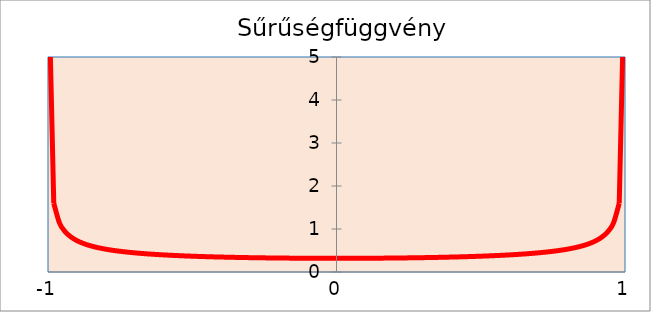
| Category | Series 0 |
|---|---|
| -0.999 | 7.119 |
| -0.98 | 1.6 |
| -0.96 | 1.137 |
| -0.94 | 0.933 |
| -0.92 | 0.812 |
| -0.9 | 0.73 |
| -0.88 | 0.67 |
| -0.86 | 0.624 |
| -0.84 | 0.587 |
| -0.82 | 0.556 |
| -0.8 | 0.531 |
| -0.78 | 0.509 |
| -0.76 | 0.49 |
| -0.74 | 0.473 |
| -0.72 | 0.459 |
| -0.7 | 0.446 |
| -0.68 | 0.434 |
| -0.66 | 0.424 |
| -0.64 | 0.414 |
| -0.62 | 0.406 |
| -0.6 | 0.398 |
| -0.58 | 0.391 |
| -0.56 | 0.384 |
| -0.54 | 0.378 |
| -0.52 | 0.373 |
| -0.5 | 0.368 |
| -0.48 | 0.363 |
| -0.46 | 0.358 |
| -0.44 | 0.354 |
| -0.419999999999999 | 0.351 |
| -0.399999999999999 | 0.347 |
| -0.379999999999999 | 0.344 |
| -0.359999999999999 | 0.341 |
| -0.339999999999999 | 0.338 |
| -0.319999999999999 | 0.336 |
| -0.299999999999999 | 0.334 |
| -0.279999999999999 | 0.332 |
| -0.259999999999999 | 0.33 |
| -0.239999999999999 | 0.328 |
| -0.219999999999999 | 0.326 |
| -0.199999999999999 | 0.325 |
| -0.179999999999999 | 0.324 |
| -0.159999999999999 | 0.322 |
| -0.139999999999999 | 0.321 |
| -0.119999999999999 | 0.321 |
| -0.099999999999999 | 0.32 |
| -0.079999999999999 | 0.319 |
| -0.0599999999999991 | 0.319 |
| -0.039999999999999 | 0.319 |
| -0.019999999999999 | 0.318 |
| 0.0 | 0.318 |
| 0.02 | 0.318 |
| 0.04 | 0.319 |
| 0.0600000000000001 | 0.319 |
| 0.0800000000000001 | 0.319 |
| 0.1 | 0.32 |
| 0.12 | 0.321 |
| 0.14 | 0.321 |
| 0.16 | 0.322 |
| 0.18 | 0.324 |
| 0.2 | 0.325 |
| 0.22 | 0.326 |
| 0.24 | 0.328 |
| 0.26 | 0.33 |
| 0.28 | 0.332 |
| 0.3 | 0.334 |
| 0.32 | 0.336 |
| 0.34 | 0.338 |
| 0.36 | 0.341 |
| 0.38 | 0.344 |
| 0.4 | 0.347 |
| 0.42 | 0.351 |
| 0.44 | 0.354 |
| 0.46 | 0.358 |
| 0.48 | 0.363 |
| 0.5 | 0.368 |
| 0.52 | 0.373 |
| 0.54 | 0.378 |
| 0.56 | 0.384 |
| 0.58 | 0.391 |
| 0.6 | 0.398 |
| 0.62 | 0.406 |
| 0.64 | 0.414 |
| 0.66 | 0.424 |
| 0.68 | 0.434 |
| 0.7 | 0.446 |
| 0.72 | 0.459 |
| 0.74 | 0.473 |
| 0.76 | 0.49 |
| 0.78 | 0.509 |
| 0.8 | 0.531 |
| 0.82 | 0.556 |
| 0.84 | 0.587 |
| 0.86 | 0.624 |
| 0.88 | 0.67 |
| 0.9 | 0.73 |
| 0.92 | 0.812 |
| 0.94 | 0.933 |
| 0.96 | 1.137 |
| 0.98 | 1.6 |
| 0.999 | 7.119 |